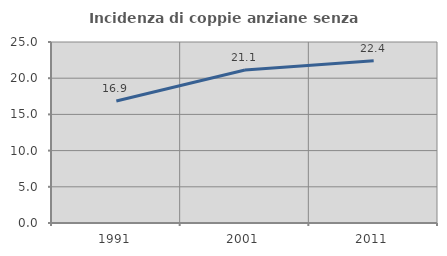
| Category | Incidenza di coppie anziane senza figli  |
|---|---|
| 1991.0 | 16.851 |
| 2001.0 | 21.136 |
| 2011.0 | 22.426 |